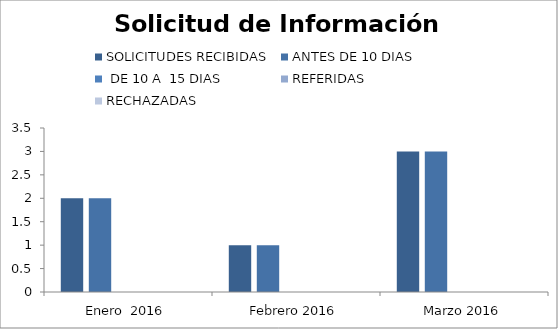
| Category | SOLICITUDES RECIBIDAS | ANTES DE 10 DIAS |  DE 10 A  15 DIAS  | REFERIDAS | RECHAZADAS |
|---|---|---|---|---|---|
| Enero  2016 | 2 | 2 | 0 | 0 | 0 |
| Febrero 2016 | 1 | 1 | 0 | 0 | 0 |
| Marzo 2016 | 3 | 3 | 0 | 0 | 0 |